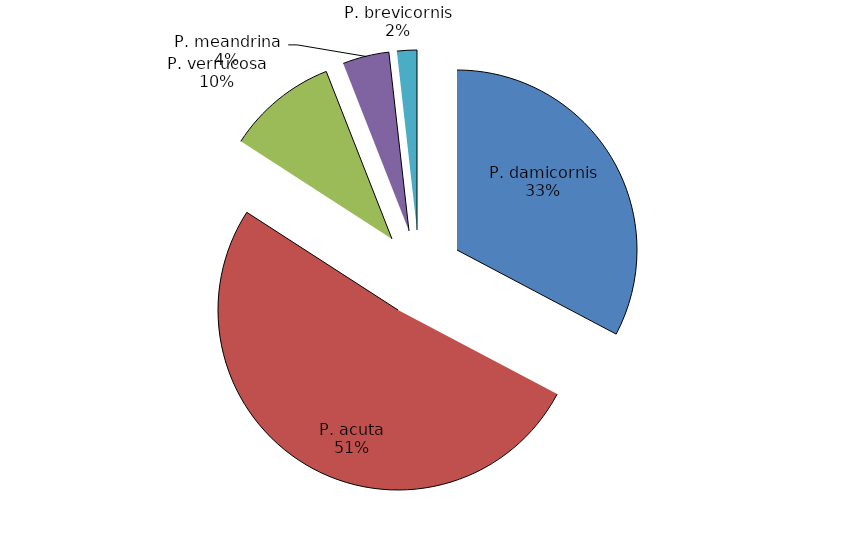
| Category | Series 0 |
|---|---|
| P. damicornis | 32.738 |
| P. acuta | 51.389 |
| P. verrucosa | 9.921 |
| P. meandrina | 4.167 |
| P. brevicornis | 1.786 |